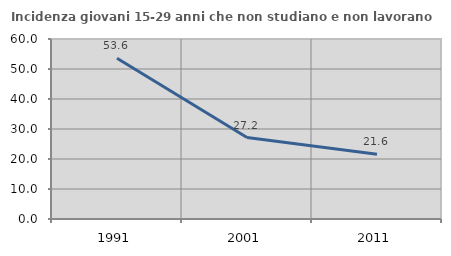
| Category | Incidenza giovani 15-29 anni che non studiano e non lavorano  |
|---|---|
| 1991.0 | 53.596 |
| 2001.0 | 27.163 |
| 2011.0 | 21.615 |